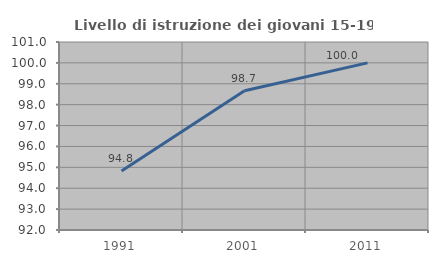
| Category | Livello di istruzione dei giovani 15-19 anni |
|---|---|
| 1991.0 | 94.828 |
| 2001.0 | 98.667 |
| 2011.0 | 100 |